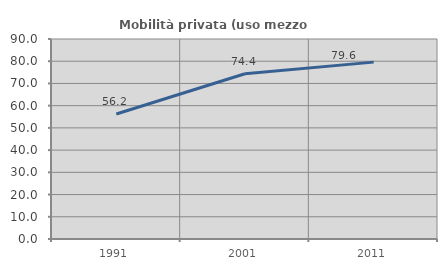
| Category | Mobilità privata (uso mezzo privato) |
|---|---|
| 1991.0 | 56.241 |
| 2001.0 | 74.356 |
| 2011.0 | 79.593 |